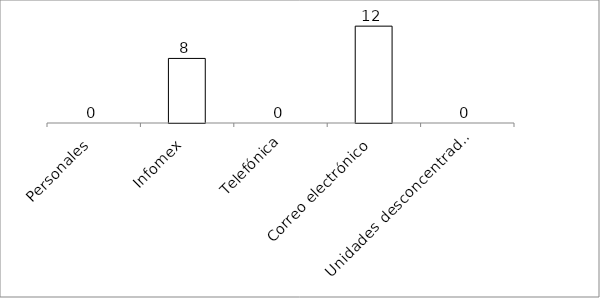
| Category | Series 0 |
|---|---|
| Personales | 0 |
| Infomex | 8 |
| Telefónica | 0 |
| Correo electrónico | 12 |
| Unidades desconcentradas | 0 |